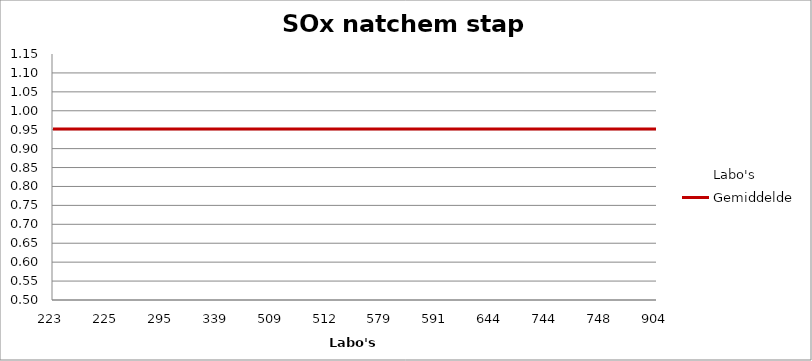
| Category | Labo's | Gemiddelde |
|---|---|---|
| 223.0 | 1.055 | 0.952 |
| 225.0 | 0.927 | 0.952 |
| 295.0 | 1.01 | 0.952 |
| 339.0 | 0.78 | 0.952 |
| 509.0 | 0.918 | 0.952 |
| 512.0 | 1.128 | 0.952 |
| 579.0 | 0.955 | 0.952 |
| 591.0 | 0.976 | 0.952 |
| 644.0 | 0.846 | 0.952 |
| 744.0 | 0.995 | 0.952 |
| 748.0 | 0.506 | 0.952 |
| 904.0 | 1.075 | 0.952 |